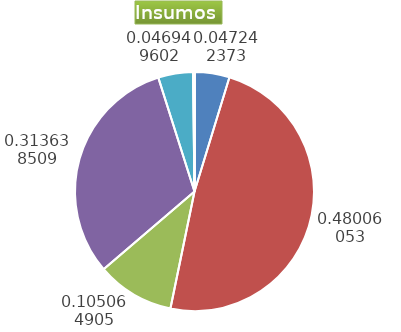
| Category | Series 0 |
|---|---|
| Control arvenses | 1222938 |
| Control fitosanitario | 12556502 |
| Cosecha y beneficio | 2719758.898 |
| Fertilización | 8118992 |
| Instalación | 1215359.187 |
| Otros | 52914 |
| Podas | 0 |
| Riego | 0 |
| Transporte | 0 |
| Tutorado | 0 |